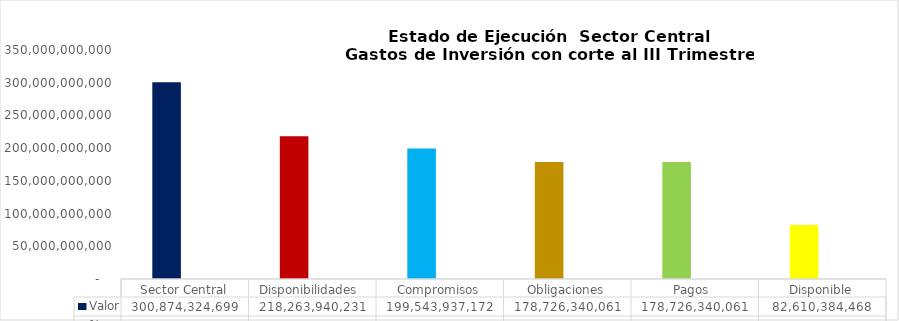
| Category | Valor | % |
|---|---|---|
| Sector Central | 300874324699.38 | 1 |
| Disponibilidades  | 218263940231.42 | 0.725 |
| Compromisos | 199543937171.6 | 0.663 |
| Obligaciones | 178726340061.37 | 0.896 |
| Pagos  | 178726340061.37 | 0.896 |
| Disponible | 82610384467.96 | 0.275 |